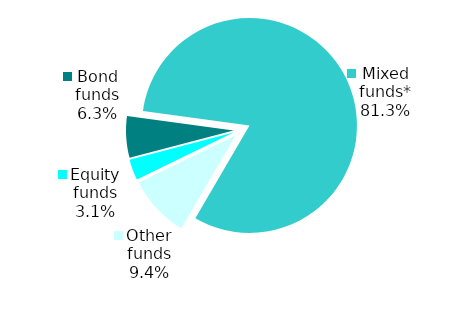
| Category | Series 0 |
|---|---|
| Equity funds | 1 |
| Bond funds | 2 |
| Mixed funds* | 26 |
| Other funds | 3 |